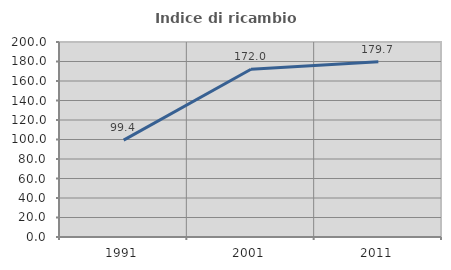
| Category | Indice di ricambio occupazionale  |
|---|---|
| 1991.0 | 99.375 |
| 2001.0 | 172 |
| 2011.0 | 179.688 |